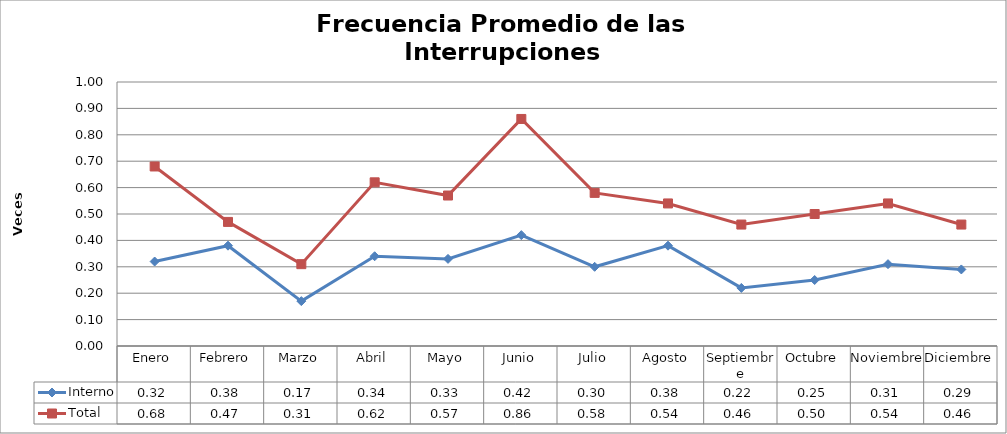
| Category | Interno | Total |
|---|---|---|
| Enero | 0.32 | 0.68 |
| Febrero | 0.38 | 0.47 |
| Marzo | 0.17 | 0.31 |
| Abril | 0.34 | 0.62 |
| Mayo | 0.33 | 0.57 |
| Junio | 0.42 | 0.86 |
| Julio | 0.3 | 0.58 |
| Agosto | 0.38 | 0.54 |
| Septiembre | 0.22 | 0.46 |
| Octubre | 0.25 | 0.5 |
| Noviembre | 0.31 | 0.54 |
| Diciembre | 0.29 | 0.46 |